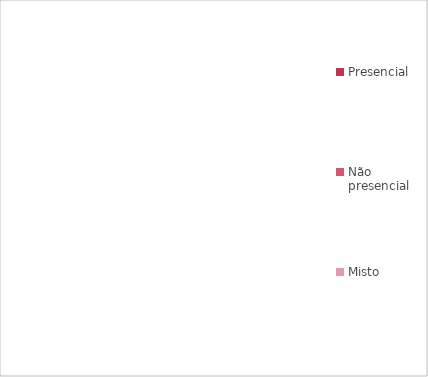
| Category | Series 0 |
|---|---|
| Presencial | 0 |
| Não presencial | 0 |
| Misto | 0 |